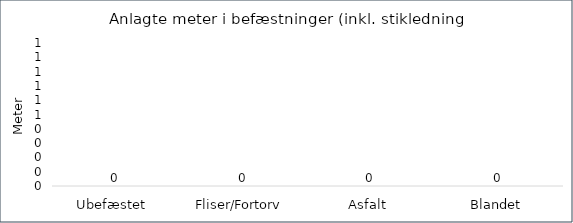
| Category | Series 1 |
|---|---|
| Ubefæstet  | 0 |
| Fliser/Fortorv  | 0 |
| Asfalt  | 0 |
| Blandet  | 0 |